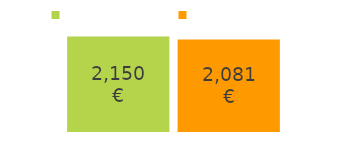
| Category | εισερχόμενα | εξερχόμενα |
|---|---|---|
| εισερχόμενα χρήματα: | 2150 | 2081 |